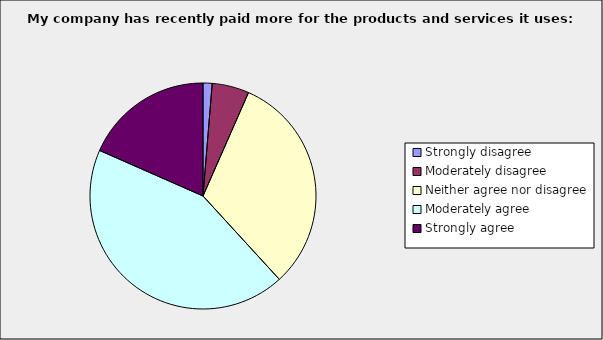
| Category | Series 0 |
|---|---|
| Strongly disagree | 0.013 |
| Moderately disagree | 0.053 |
| Neither agree nor disagree | 0.316 |
| Moderately agree | 0.434 |
| Strongly agree | 0.184 |